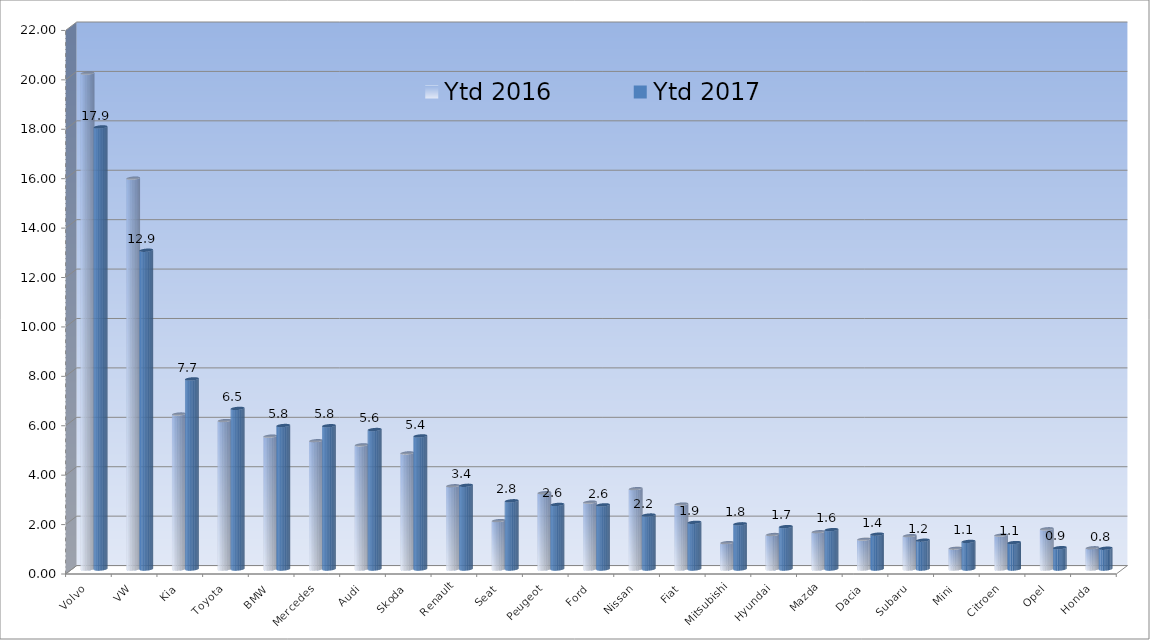
| Category | Ytd 2016 | Ytd 2017 |
|---|---|---|
| Volvo | 20.069 | 17.893 |
| VW | 15.819 | 12.902 |
| Kia | 6.271 | 7.695 |
| Toyota | 6.007 | 6.5 |
| BMW | 5.376 | 5.808 |
| Mercedes | 5.193 | 5.8 |
| Audi | 5.024 | 5.645 |
| Skoda | 4.696 | 5.386 |
| Renault | 3.368 | 3.387 |
| Seat | 1.958 | 2.761 |
| Peugeot | 3.087 | 2.614 |
| Ford | 2.705 | 2.596 |
| Nissan | 3.252 | 2.184 |
| Fiat | 2.627 | 1.889 |
| Mitsubishi | 1.067 | 1.829 |
| Hyundai | 1.395 | 1.716 |
| Mazda | 1.508 | 1.593 |
| Dacia | 1.207 | 1.409 |
| Subaru | 1.349 | 1.166 |
| Mini | 0.842 | 1.116 |
| Citroen | 1.37 | 1.07 |
| Opel | 1.627 | 0.863 |
| Honda | 0.858 | 0.841 |